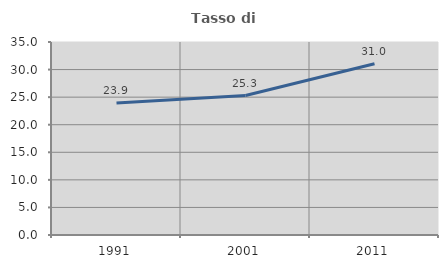
| Category | Tasso di occupazione   |
|---|---|
| 1991.0 | 23.937 |
| 2001.0 | 25.296 |
| 2011.0 | 31.045 |